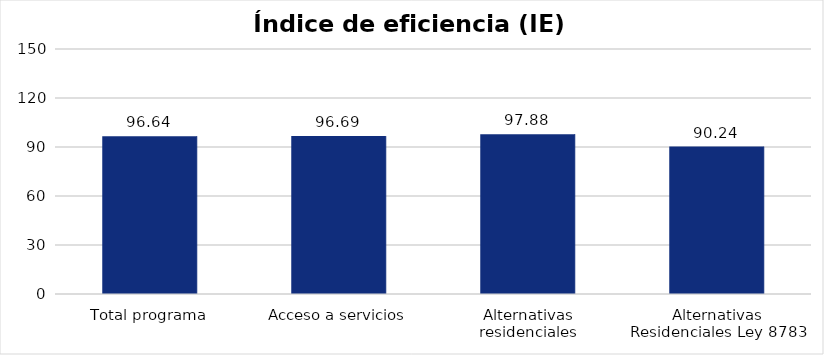
| Category | Índice de eficiencia (IE)  |
|---|---|
| Total programa | 96.639 |
| Acceso a servicios | 96.691 |
| Alternativas residenciales | 97.876 |
| Alternativas Residenciales Ley 8783 | 90.244 |